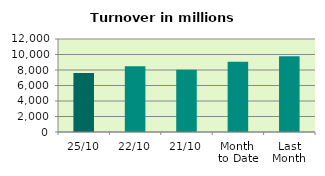
| Category | Series 0 |
|---|---|
| 25/10 | 7599.107 |
| 22/10 | 8485.841 |
| 21/10 | 8030.61 |
| Month 
to Date | 9064.595 |
| Last
Month | 9769.37 |